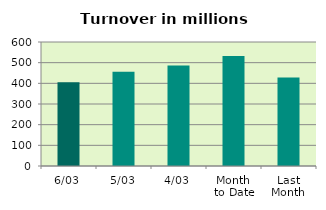
| Category | Series 0 |
|---|---|
| 6/03 | 405.714 |
| 5/03 | 455.85 |
| 4/03 | 486.363 |
| Month 
to Date | 531.905 |
| Last
Month | 428.598 |